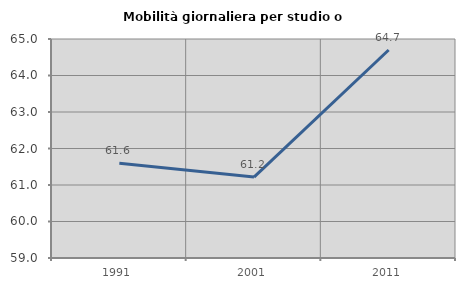
| Category | Mobilità giornaliera per studio o lavoro |
|---|---|
| 1991.0 | 61.598 |
| 2001.0 | 61.217 |
| 2011.0 | 64.698 |